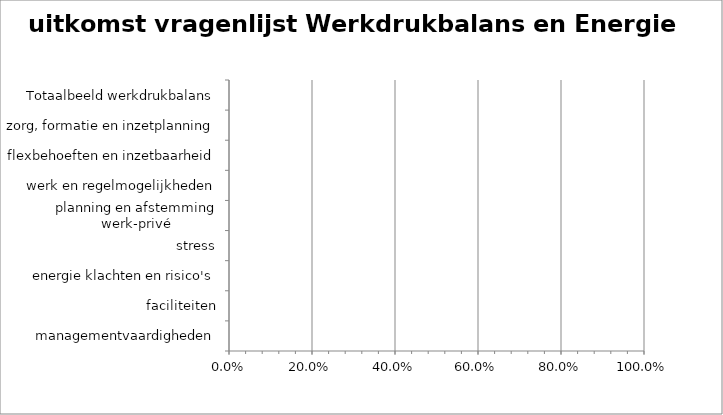
| Category | uitkomst vragenlijst 1 |
|---|---|
| Totaalbeeld werkdrukbalans | 0 |
| zorg, formatie en inzetplanning | 0 |
| flexbehoeften en inzetbaarheid | 0 |
| werk en regelmogelijkheden | 0 |
| planning en afstemming werk-privé | 0 |
| stress | 0 |
| energie klachten en risico's | 0 |
| faciliteiten | 0 |
| managementvaardigheden | 0 |